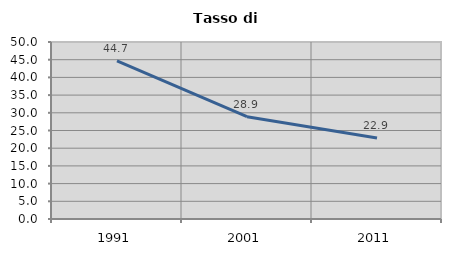
| Category | Tasso di disoccupazione   |
|---|---|
| 1991.0 | 44.688 |
| 2001.0 | 28.888 |
| 2011.0 | 22.906 |